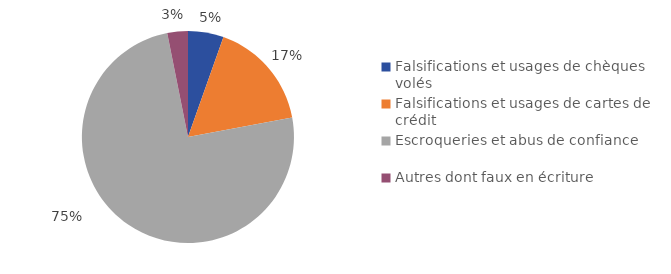
| Category | Series 0 |
|---|---|
| Falsifications et usages de chèques volés | 19700 |
| Falsifications et usages de cartes de crédit | 60300 |
| Escroqueries et abus de confiance | 271300 |
| Autres dont faux en écriture | 11400 |